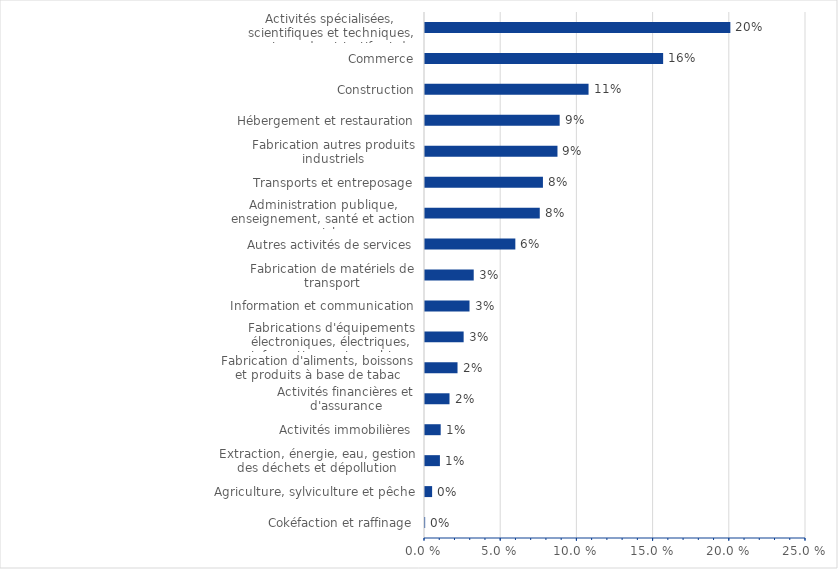
| Category | Series 0 |
|---|---|
| Cokéfaction et raffinage | 0 |
| Agriculture, sylviculture et pêche | 0.005 |
| Extraction, énergie, eau, gestion des déchets et dépollution | 0.01 |
| Activités immobilières | 0.01 |
| Activités financières et d'assurance | 0.016 |
| Fabrication d'aliments, boissons et produits à base de tabac | 0.021 |
| Fabrications d'équipements électroniques, électriques, informatiques et machines | 0.025 |
| Information et communication | 0.029 |
| Fabrication de matériels de transport | 0.032 |
| Autres activités de services | 0.059 |
| Administration publique, enseignement, santé et action sociale | 0.075 |
| Transports et entreposage | 0.077 |
| Fabrication autres produits industriels | 0.087 |
| Hébergement et restauration | 0.088 |
| Construction | 0.107 |
| Commerce | 0.156 |
| Activités spécialisées, scientifiques et techniques, services admnistratifs et de soutien | 0.2 |